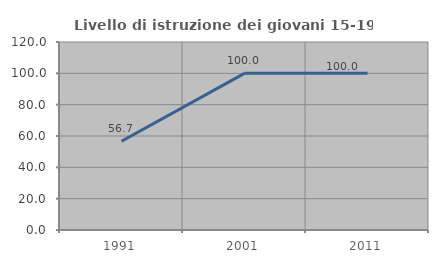
| Category | Livello di istruzione dei giovani 15-19 anni |
|---|---|
| 1991.0 | 56.667 |
| 2001.0 | 100 |
| 2011.0 | 100 |